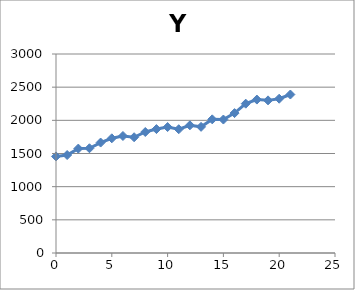
| Category | Y |
|---|---|
| 0.0 | 1456 |
| 1.0 | 1477 |
| 2.0 | 1574 |
| 3.0 | 1579 |
| 4.0 | 1665 |
| 5.0 | 1729 |
| 6.0 | 1764 |
| 7.0 | 1745 |
| 8.0 | 1824 |
| 9.0 | 1868 |
| 10.0 | 1899 |
| 11.0 | 1866 |
| 12.0 | 1925 |
| 13.0 | 1902 |
| 14.0 | 2015 |
| 15.0 | 2012 |
| 16.0 | 2109 |
| 17.0 | 2251 |
| 18.0 | 2313 |
| 19.0 | 2301 |
| 20.0 | 2326 |
| 21.0 | 2389 |